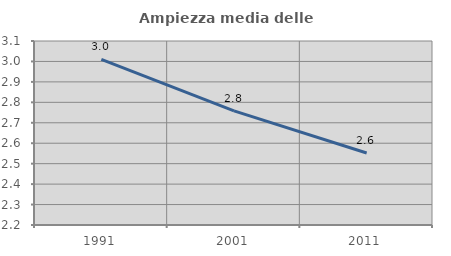
| Category | Ampiezza media delle famiglie |
|---|---|
| 1991.0 | 3.011 |
| 2001.0 | 2.758 |
| 2011.0 | 2.552 |